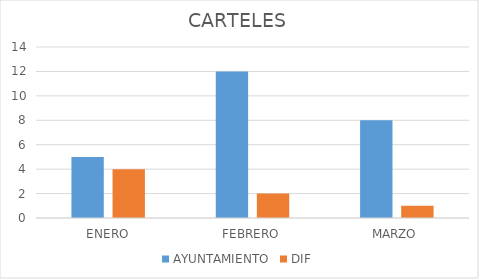
| Category | AYUNTAMIENTO | DIF |
|---|---|---|
| ENERO | 5 | 4 |
| FEBRERO | 12 | 2 |
| MARZO | 8 | 1 |